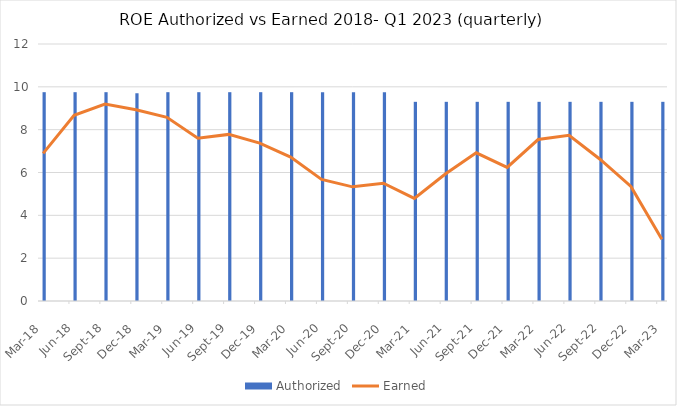
| Category | Authorized |
|---|---|
| Mar-18 | 9.75 |
| Jun-18 | 9.75 |
| Sep-18 | 9.75 |
| Dec-18 | 9.7 |
| Mar-19 | 9.75 |
| Jun-19 | 9.75 |
| Sep-19 | 9.75 |
| Dec-19 | 9.75 |
| Mar-20 | 9.75 |
| Jun-20 | 9.75 |
| Sep-20 | 9.75 |
| Dec-20 | 9.75 |
| Mar-21 | 9.3 |
| Jun-21 | 9.3 |
| Sep-21 | 9.3 |
| Dec-21 | 9.3 |
| Mar-22 | 9.3 |
| Jun-22 | 9.3 |
| Sep-22 | 9.3 |
| Dec-22 | 9.3 |
| Mar-23 | 9.3 |